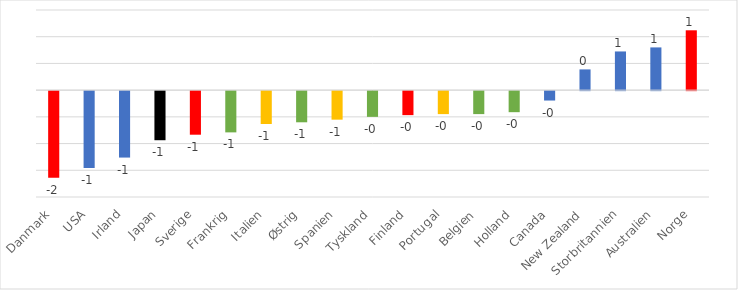
| Category | Series 0 |
|---|---|
| Danmark | -1.619 |
| USA | -1.439 |
| Irland | -1.243 |
| Japan | -0.919 |
| Sverige | -0.815 |
| Frankrig | -0.772 |
| Italien | -0.615 |
| Østrig | -0.583 |
| Spanien | -0.534 |
| Tyskland | -0.481 |
| Finland | -0.449 |
| Portugal | -0.43 |
| Belgien | -0.43 |
| Holland | -0.394 |
| Canada | -0.176 |
| New Zealand | 0.388 |
| Storbritannien | 0.724 |
| Australien | 0.8 |
| Norge | 1.12 |